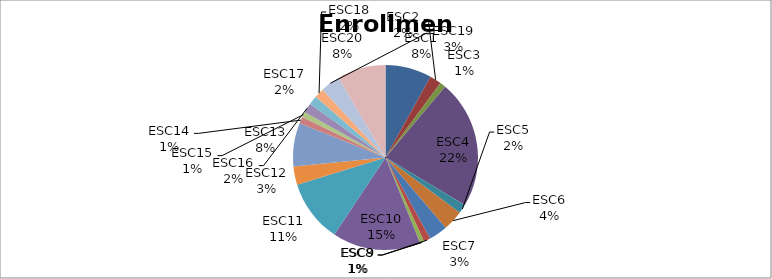
| Category | Enrollment |
|---|---|
| ESC1 | 423921 |
| ESC2 | 105597 |
| ESC3 | 54371 |
| ESC4 | 1174942 |
| ESC5 | 82617 |
| ESC6 | 185402 |
| ESC7 | 170701 |
| ESC8 | 61184 |
| ESC9 | 37910 |
| ESC10 | 807913 |
| ESC11 | 570787 |
| ESC12 | 168306 |
| ESC13 | 397928 |
| ESC14 | 59997 |
| ESC15 | 49969 |
| ESC16 | 86346 |
| ESC17 | 84299 |
| ESC18 | 87906 |
| ESC19 | 179755 |
| ESC20 | 443587 |